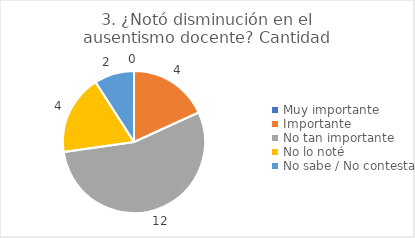
| Category | 3. ¿Notó disminución en el ausentismo docente? |
|---|---|
| Muy importante  | 0 |
| Importante  | 0.182 |
| No tan importante  | 0.545 |
| No lo noté  | 0.182 |
| No sabe / No contesta | 0.091 |